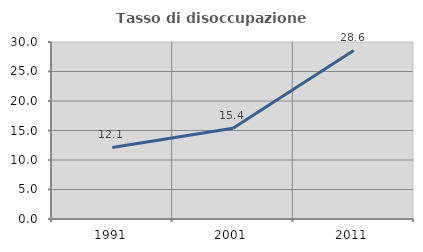
| Category | Tasso di disoccupazione giovanile  |
|---|---|
| 1991.0 | 12.121 |
| 2001.0 | 15.385 |
| 2011.0 | 28.571 |